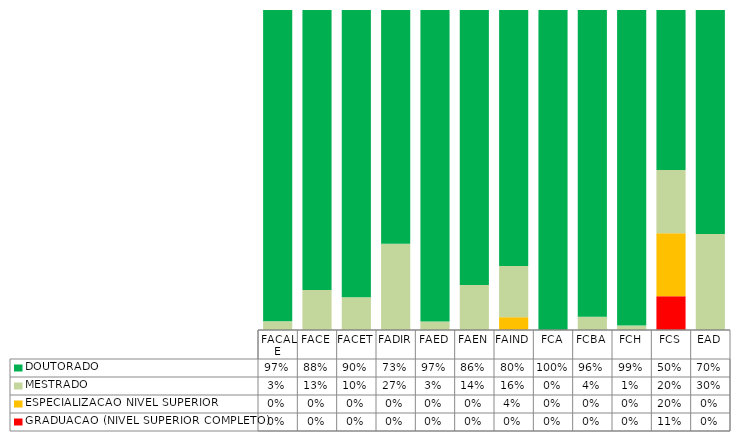
| Category | GRADUACAO (NIVEL SUPERIOR COMPLETO) | ESPECIALIZACAO NIVEL SUPERIOR | MESTRADO | DOUTORADO |
|---|---|---|---|---|
| FACALE | 0 | 0 | 0.027 | 0.973 |
| FACE | 0 | 0 | 0.125 | 0.875 |
| FACET | 0 | 0 | 0.102 | 0.898 |
| FADIR | 0 | 0 | 0.269 | 0.731 |
| FAED | 0 | 0 | 0.026 | 0.974 |
| FAEN | 0 | 0 | 0.14 | 0.86 |
| FAIND | 0 | 0.04 | 0.16 | 0.8 |
| FCA | 0 | 0 | 0 | 1 |
| FCBA | 0 | 0 | 0.042 | 0.958 |
| FCH | 0 | 0 | 0.014 | 0.986 |
| FCS | 0.105 | 0.197 | 0.197 | 0.5 |
| EAD | 0 | 0 | 0.3 | 0.7 |